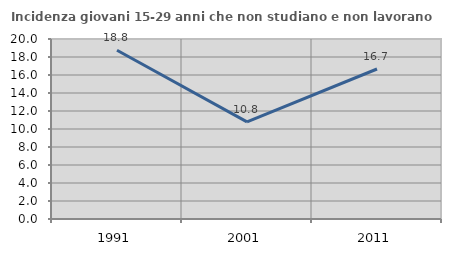
| Category | Incidenza giovani 15-29 anni che non studiano e non lavorano  |
|---|---|
| 1991.0 | 18.75 |
| 2001.0 | 10.795 |
| 2011.0 | 16.667 |